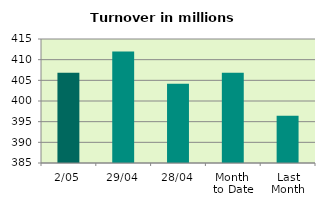
| Category | Series 0 |
|---|---|
| 2/05 | 406.843 |
| 29/04 | 412.001 |
| 28/04 | 404.163 |
| Month 
to Date | 406.843 |
| Last
Month | 396.429 |